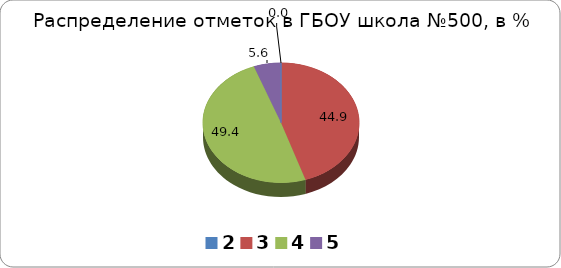
| Category | Series 0 |
|---|---|
| 2.0 | 0 |
| 3.0 | 44.94 |
| 4.0 | 49.44 |
| 5.0 | 5.62 |